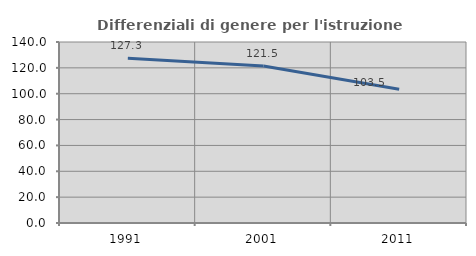
| Category | Differenziali di genere per l'istruzione superiore |
|---|---|
| 1991.0 | 127.341 |
| 2001.0 | 121.485 |
| 2011.0 | 103.476 |